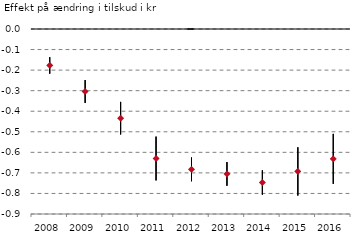
| Category | Serie 1 | Serie 2 | Serie 3 |
|---|---|---|---|
| 2008.0 | -0.218 | -0.137 | -0.177 |
| 2009.0 | -0.36 | -0.248 | -0.304 |
| 2010.0 | -0.513 | -0.355 | -0.434 |
| 2011.0 | -0.737 | -0.524 | -0.63 |
| 2012.0 | -0.741 | -0.625 | -0.683 |
| 2013.0 | -0.763 | -0.647 | -0.705 |
| 2014.0 | -0.806 | -0.687 | -0.747 |
| 2015.0 | -0.81 | -0.575 | -0.693 |
| 2016.0 | -0.753 | -0.51 | -0.632 |